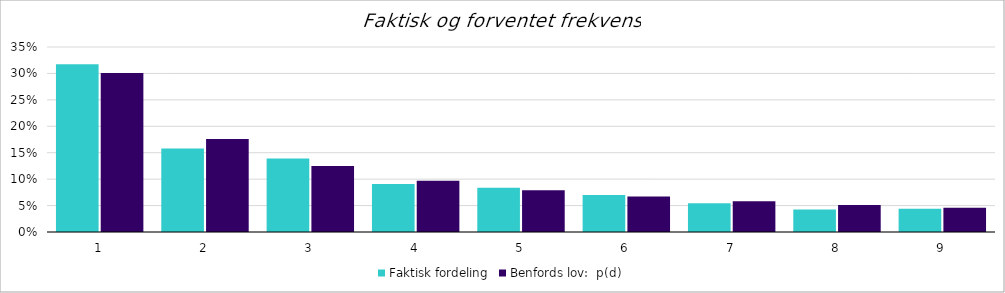
| Category | Faktisk fordeling | Benfords lov:  p(d) |
|---|---|---|
| 1.0 | 0.317 | 0.301 |
| 2.0 | 0.158 | 0.176 |
| 3.0 | 0.139 | 0.125 |
| 4.0 | 0.091 | 0.097 |
| 5.0 | 0.084 | 0.079 |
| 6.0 | 0.07 | 0.067 |
| 7.0 | 0.054 | 0.058 |
| 8.0 | 0.042 | 0.051 |
| 9.0 | 0.044 | 0.046 |